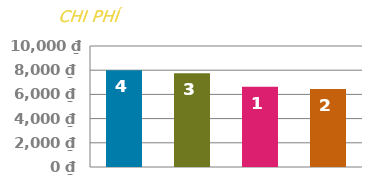
| Category | TRẢ TRƯỚC |
|---|---|
| 0 | 8000 |
| 1 | 7750 |
| 2 | 6625 |
| 3 | 6450 |